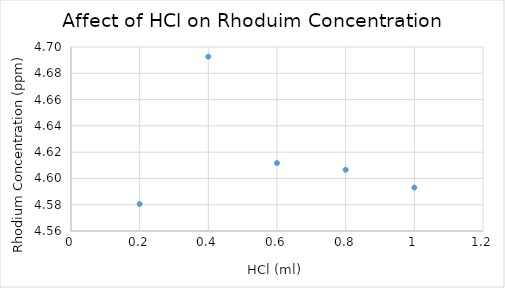
| Category | Series 0 |
|---|---|
| 1.0 | 4.593 |
| 0.8 | 4.607 |
| 0.6 | 4.612 |
| 0.4 | 4.693 |
| 0.2 | 4.581 |